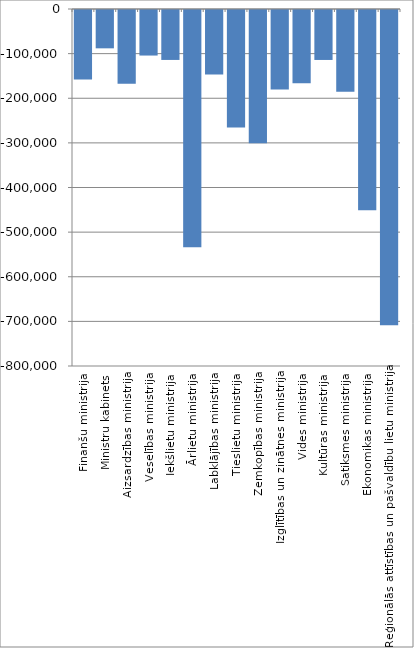
| Category | Series 0 |
|---|---|
| Finanšu ministrija | -155995.192 |
| Ministru kabinets | -85891.808 |
| Aizsardzības ministrija | -165515.747 |
| Veselības ministrija | -102065.745 |
| Iekšlietu ministrija | -111905.857 |
| Ārlietu ministrija | -531900.382 |
| Labklājības ministrija | -144775.781 |
| Tieslietu ministrija | -263037.905 |
| Zemkopības ministrija | -298650.115 |
| Izglītības un zinātnes ministrija | -177986.997 |
| Vides ministrija | -163972.757 |
| Kultūras ministrija | -111939.707 |
| Satiksmes ministrija | -182971.588 |
| Ekonomikas ministrija | -448676.728 |
| Reģionālās attīstības un pašvaldību lietu ministrija | -706572.963 |